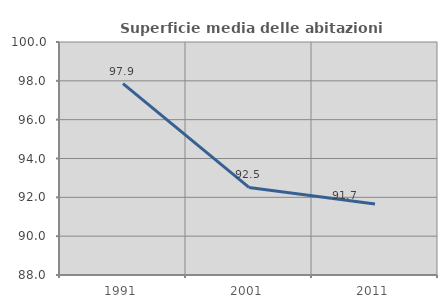
| Category | Superficie media delle abitazioni occupate |
|---|---|
| 1991.0 | 97.856 |
| 2001.0 | 92.512 |
| 2011.0 | 91.659 |